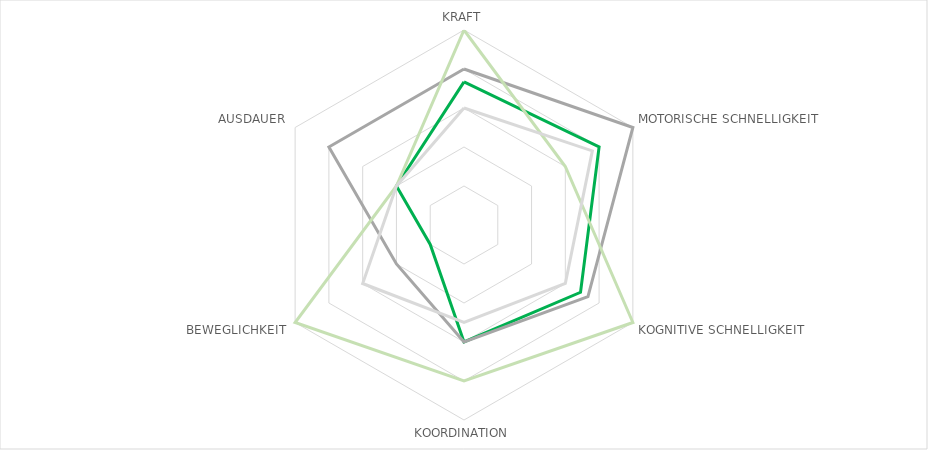
| Category | Series 0 | Series 1 | Series 2 | Series 3 |
|---|---|---|---|---|
| KRAFT | 3.67 | 4 | 5 | 3 |
| MOTORISCHE SCHNELLIGKEIT | 4 | 5 | 3 | 3.8 |
| KOGNITIVE SCHNELLIGKEIT | 3.45 | 3.67 | 5 | 3 |
| KOORDINATION | 3 | 3 | 4 | 2.5 |
| BEWEGLICHKEIT | 1 | 2 | 5 | 3 |
| AUSDAUER | 2 | 4 | 2 | 2 |